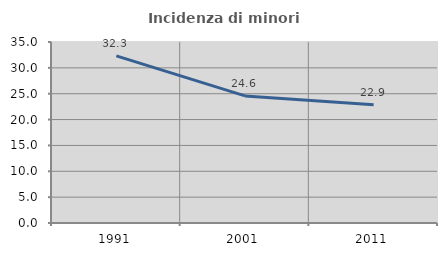
| Category | Incidenza di minori stranieri |
|---|---|
| 1991.0 | 32.308 |
| 2001.0 | 24.576 |
| 2011.0 | 22.866 |